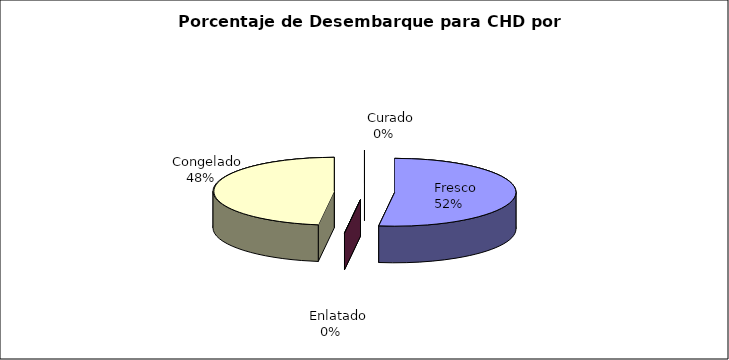
| Category | Series 0 |
|---|---|
|     Fresco | 5690.05 |
|     Enlatado | 0 |
|     Congelado | 5230.15 |
|     Curado | 0 |